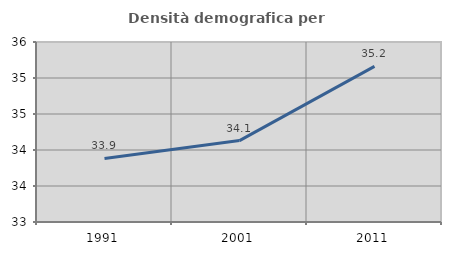
| Category | Densità demografica |
|---|---|
| 1991.0 | 33.883 |
| 2001.0 | 34.131 |
| 2011.0 | 35.162 |